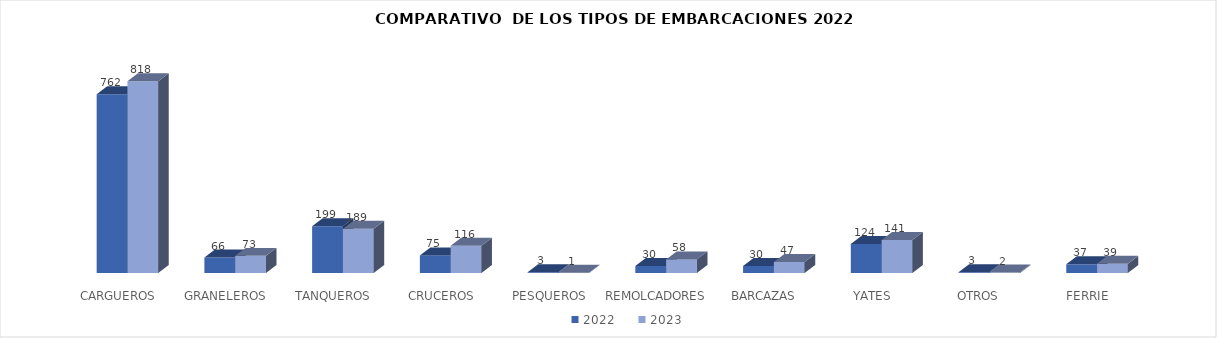
| Category | 2022 | 2023 |
|---|---|---|
| CARGUEROS | 762 | 818 |
| GRANELEROS | 66 | 73 |
| TANQUEROS | 199 | 189 |
| CRUCEROS | 75 | 116 |
| PESQUEROS | 3 | 1 |
| REMOLCADORES | 30 | 58 |
| BARCAZAS | 30 | 47 |
| YATES | 124 | 141 |
| OTROS  | 3 | 2 |
| FERRIE | 37 | 39 |